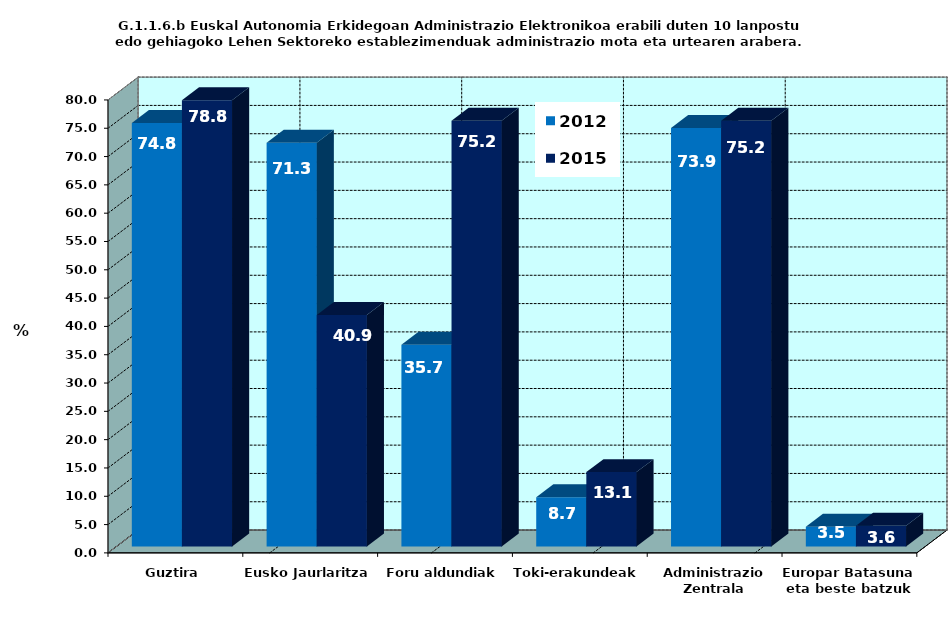
| Category | 2012 | 2015 |
|---|---|---|
| Guztira | 74.783 | 78.832 |
| Eusko Jaurlaritza | 71.304 | 40.876 |
| Foru aldundiak | 35.652 | 75.182 |
| Toki-erakundeak | 8.696 | 13.139 |
| Administrazio Zentrala | 73.913 | 75.182 |
| Europar Batasuna eta beste batzuk | 3.478 | 3.65 |